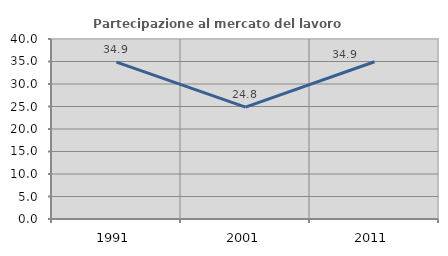
| Category | Partecipazione al mercato del lavoro  femminile |
|---|---|
| 1991.0 | 34.855 |
| 2001.0 | 24.844 |
| 2011.0 | 34.945 |